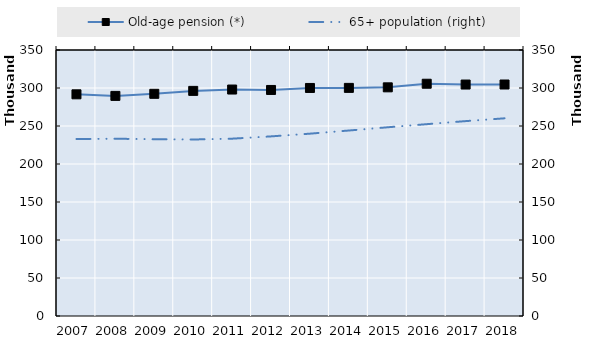
| Category | Old-age pension (*) | 0 | Series 14 | Series 15 | Series 16 | Series 17 | Series 18 |
|---|---|---|---|---|---|---|---|
| 2007.0 | 291689.75 |  |  |  |  |  |  |
| 2008.0 | 289602.5 |  |  |  |  |  |  |
| 2009.0 | 292343 |  |  |  |  |  |  |
| 2010.0 | 296199 |  |  |  |  |  |  |
| 2011.0 | 297985 |  |  |  |  |  |  |
| 2012.0 | 297413 |  |  |  |  |  |  |
| 2013.0 | 300047 |  |  |  |  |  |  |
| 2014.0 | 300151 |  |  |  |  |  |  |
| 2015.0 | 300884 |  |  |  |  |  |  |
| 2016.0 | 305610 |  |  |  |  |  |  |
| 2017.0 | 304556 |  |  |  |  |  |  |
| 2018.0 | 304593 |  |  |  |  |  |  |